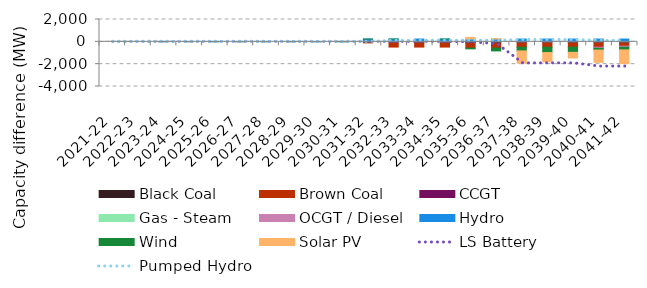
| Category | Black Coal | Brown Coal | CCGT | Gas - Steam | OCGT / Diesel | Hydro | Wind | Solar PV |
|---|---|---|---|---|---|---|---|---|
| 2021-22 | 0 | 0 | 0 | 0 | 0 | 0 | 0 | 0 |
| 2022-23 | 0 | 0 | 0 | 0 | 0 | 0 | 0 | 0 |
| 2023-24 | 0 | 0 | 0 | 0 | 0 | 0 | 0 | 0 |
| 2024-25 | 0 | 0 | 0 | 0 | 0 | 0 | 0 | 0 |
| 2025-26 | 0 | 0 | 0 | 0 | 0 | 0 | 0 | 0 |
| 2026-27 | 0 | 0 | 0 | 0 | 0 | 0 | 0 | 0 |
| 2027-28 | 0 | 0 | 0 | 0 | 0 | 0 | 0 | 0 |
| 2028-29 | 0 | 0 | 0 | 0 | 0 | 0 | 0 | 0 |
| 2029-30 | 0 | 0 | 0 | 0 | 0 | 0 | 0 | 0 |
| 2030-31 | 0 | 0 | 0 | 0 | 0 | 0 | 0 | 0 |
| 2031-32 | 0 | -93.948 | 0 | 0 | 0 | 250 | 0 | 0 |
| 2032-33 | 0 | -468.946 | 0 | 0 | 0 | 250 | 0 | 0 |
| 2033-34 | 0 | -468.946 | 0 | 0 | 0 | 250 | 0 | 0 |
| 2034-35 | 0 | -468.946 | 0 | 0 | 0 | 250 | 0 | 0 |
| 2035-36 | -89.406 | -468.946 | 0 | 0 | 0 | 250 | -70.234 | 150 |
| 2036-37 | -89.406 | -468.946 | 0 | 0 | 0 | 250 | -254.102 | 44.121 |
| 2037-38 | -12.137 | -468.946 | 0 | 0 | 0 | 250 | -332.202 | -1094.956 |
| 2038-39 | -12.137 | -468.946 | 0 | 0 | 0 | 250 | -477.014 | -831.476 |
| 2039-40 | -12.137 | -468.946 | 0 | 0 | 0 | 250 | -460.226 | -505.021 |
| 2040-41 | -12.137 | -468.946 | 0 | 0 | -98.019 | 250 | -160.879 | -1096.699 |
| 2041-42 | -12.137 | -374.999 | 0 | 0 | -98.019 | 250 | -235.554 | -1234.633 |